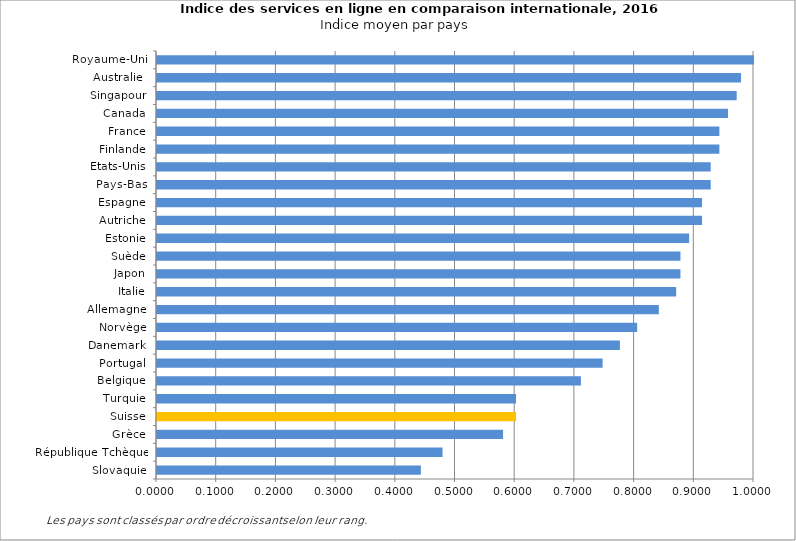
| Category | Indice moyen |
|---|---|
| Slovaquie | 0.442 |
| République Tchèque | 0.478 |
| Grèce | 0.58 |
| Suisse | 0.601 |
| Turquie | 0.601 |
| Belgique | 0.71 |
| Portugal | 0.746 |
| Danemark | 0.775 |
| Norvège | 0.804 |
| Allemagne | 0.841 |
| Italie | 0.87 |
| Japon | 0.877 |
| Suède | 0.877 |
| Estonie | 0.891 |
| Autriche | 0.913 |
| Espagne | 0.913 |
| Pays-Bas | 0.928 |
| Etats-Unis | 0.928 |
| Finlande | 0.942 |
| France | 0.942 |
| Canada | 0.956 |
| Singapour | 0.971 |
| Australie  | 0.978 |
| Royaume-Uni | 1 |